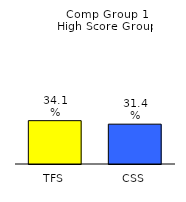
| Category | Series 0 |
|---|---|
| TFS | 0.341 |
| CSS | 0.314 |